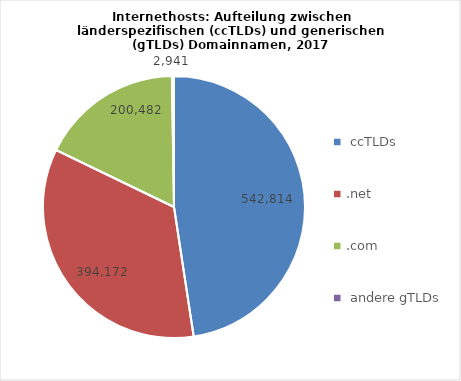
| Category | 2017 |
|---|---|
|  ccTLDs | 542813.994 |
| .net | 394172.298 |
| .com | 200481.812 |
|  andere gTLDs | 2941.304 |